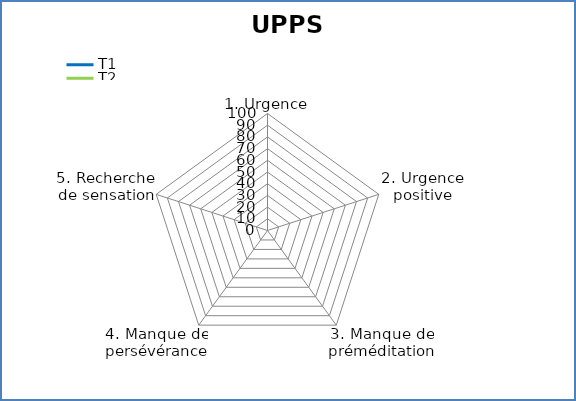
| Category | T1 | T2 |
|---|---|---|
| 1. Urgence | 0 | 0 |
| 2. Urgence positive | 0 | 0 |
| 3. Manque de préméditation | 0 | 0 |
| 4. Manque de persévérance | 0 | 0 |
| 5. Recherche de sensation | 0 | 0 |